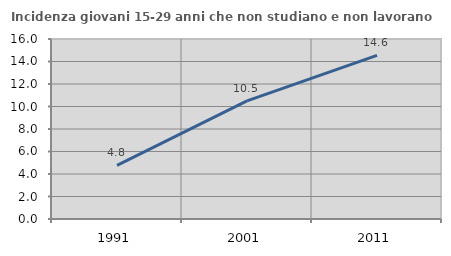
| Category | Incidenza giovani 15-29 anni che non studiano e non lavorano  |
|---|---|
| 1991.0 | 4.762 |
| 2001.0 | 10.505 |
| 2011.0 | 14.552 |